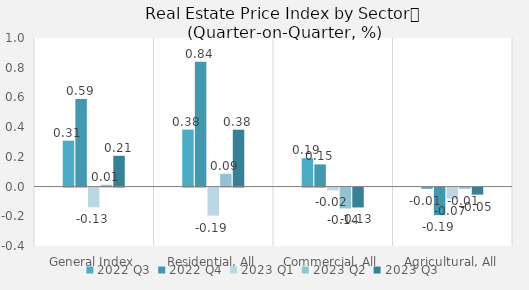
| Category | 2022 | 2023 |
|---|---|---|
| General Index | 0.589 | 0.207 |
| Residential, All | 0.839 | 0.383 |
| Commercial, All | 0.149 | -0.134 |
| Agricultural, All | -0.186 | -0.048 |